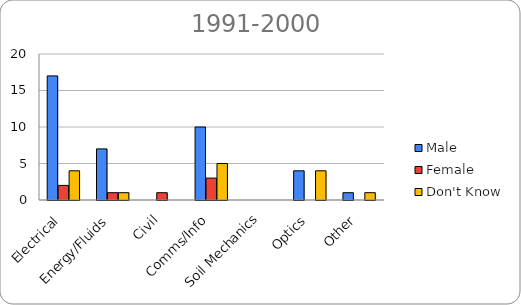
| Category | Male | Female | Don't Know |
|---|---|---|---|
| Electrical | 17 | 2 | 4 |
| Energy/Fluids | 7 | 1 | 1 |
| Civil | 0 | 1 | 0 |
| Comms/Info | 10 | 3 | 5 |
| Soil Mechanics | 0 | 0 | 0 |
| Optics | 4 | 0 | 4 |
| Other | 1 | 0 | 1 |